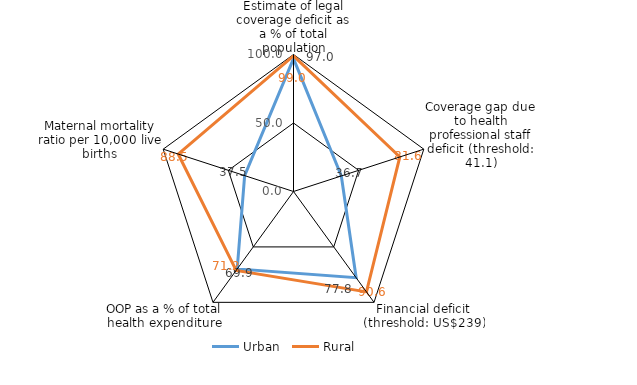
| Category | Urban | Rural |
|---|---|---|
| Estimate of legal coverage deficit as a % of total population | 97 | 99 |
| Coverage gap due to health professional staff deficit (threshold: 41.1) | 36.7 | 81.6 |
| Financial deficit (threshold: US$239) | 77.8 | 90.6 |
| OOP as a % of total health expenditure | 69.9 | 71.2 |
| Maternal mortality ratio per 10,000 live births | 37.5 | 88.5 |